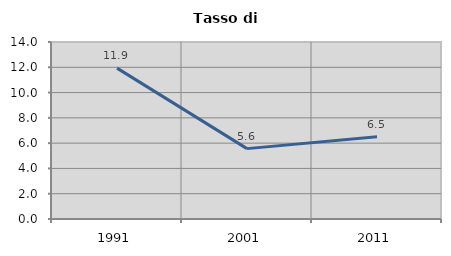
| Category | Tasso di disoccupazione   |
|---|---|
| 1991.0 | 11.935 |
| 2001.0 | 5.567 |
| 2011.0 | 6.506 |